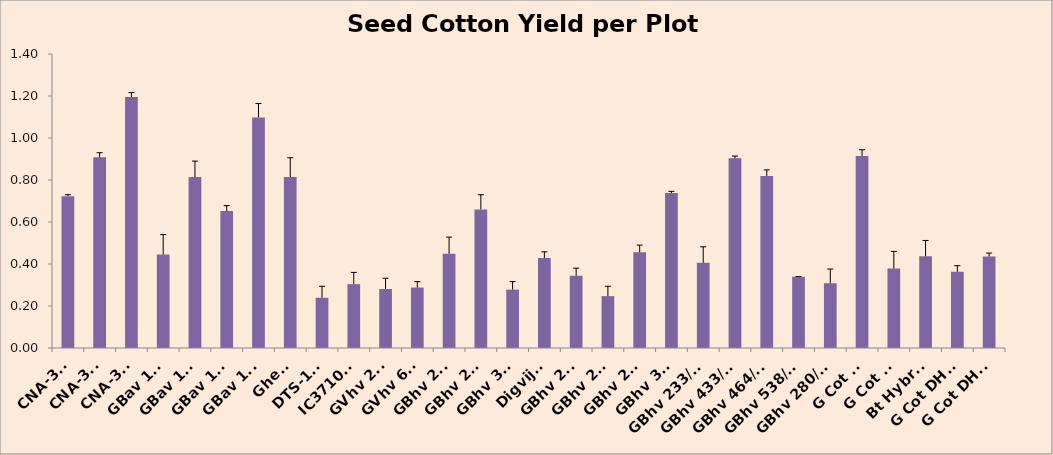
| Category | Seed Cotton Yield per Plot (Kg) |
|---|---|
| CNA-347 | 0.723 |
| CNA-375 | 0.908 |
| CNA-398 | 1.195 |
| GBav 109 | 0.445 |
| GBav 120 | 0.814 |
| GBav 124 | 0.652 |
| GBav 131 | 1.098 |
| Gheti | 0.814 |
| DTS-123 | 0.239 |
| IC371099 | 0.304 |
| GVhv 235 | 0.281 |
| GVhv 682 | 0.288 |
| GBhv 287 | 0.449 |
| GBhv 297 | 0.66 |
| GBhv 305 | 0.278 |
| Digvijay | 0.429 |
| GBhv 280 | 0.344 |
| GBhv 293 | 0.247 |
| GBhv 291 | 0.456 |
| GBhv 306 | 0.738 |
| GBhv 233/09 | 0.406 |
| GBhv 433/08 | 0.903 |
| GBhv 464/08 | 0.819 |
| GBhv 538/08 | 0.339 |
| GBhv 280/11 | 0.308 |
| G Cot 23 | 0.914 |
| G Cot 25 | 0.379 |
| Bt Hybrid | 0.437 |
| G Cot DH-7 | 0.363 |
| G Cot DH-9 | 0.436 |